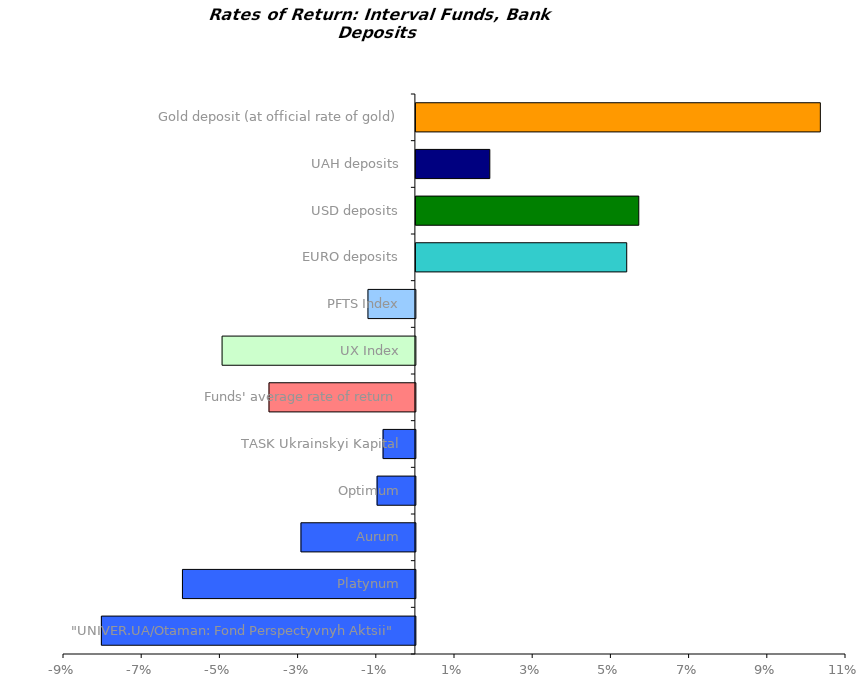
| Category | Series 0 |
|---|---|
| "UNIVER.UA/Otaman: Fond Perspectyvnyh Aktsii" | -0.08 |
| Platynum | -0.06 |
| Aurum | -0.029 |
| Optimum | -0.01 |
| TASK Ukrainskyi Kapital | -0.008 |
| Funds' average rate of return | -0.037 |
| UX Index | -0.049 |
| PFTS Index | -0.012 |
| EURO deposits | 0.054 |
| USD deposits | 0.057 |
| UAH deposits | 0.019 |
| Gold deposit (at official rate of gold) | 0.103 |